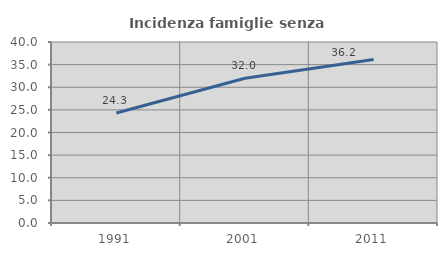
| Category | Incidenza famiglie senza nuclei |
|---|---|
| 1991.0 | 24.299 |
| 2001.0 | 32 |
| 2011.0 | 36.154 |